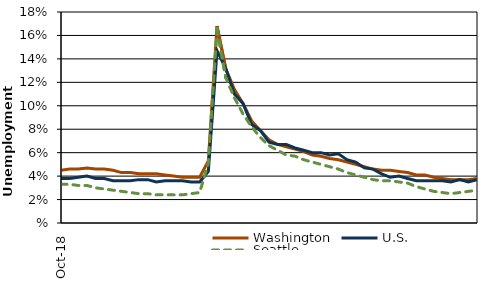
| Category | Washington | U.S. | Seattle |
|---|---|---|---|
| 2018-10-01 | 4.5 | 3.8 | 3.3 |
| 2018-11-01 | 4.6 | 3.8 | 3.3 |
| 2018-12-01 | 4.6 | 3.9 | 3.2 |
| 2019-01-01 | 4.7 | 4 | 3.2 |
| 2019-02-01 | 4.6 | 3.8 | 3 |
| 2019-03-01 | 4.6 | 3.8 | 2.9 |
| 2019-04-01 | 4.5 | 3.6 | 2.8 |
| 2019-05-01 | 4.3 | 3.6 | 2.7 |
| 2019-06-01 | 4.3 | 3.6 | 2.6 |
| 2019-07-01 | 4.2 | 3.7 | 2.5 |
| 2019-08-01 | 4.2 | 3.7 | 2.5 |
| 2019-09-01 | 4.2 | 3.5 | 2.4 |
| 2019-10-01 | 4.1 | 3.6 | 2.4 |
| 2019-11-01 | 4 | 3.6 | 2.4 |
| 2019-12-01 | 3.9 | 3.6 | 2.4 |
| 2020-01-01 | 3.9 | 3.5 | 2.5 |
| 2020-02-01 | 3.9 | 3.5 | 2.6 |
| 2020-03-01 | 5.3 | 4.4 | 5.1 |
| 2020-04-01 | 16.8 | 14.7 | 16.6 |
| 2020-05-01 | 13.2 | 13.2 | 12.4 |
| 2020-06-01 | 11.4 | 11 | 10.7 |
| 2020-07-01 | 10.2 | 10.2 | 9.3 |
| 2020-08-01 | 8.7 | 8.4 | 8.2 |
| 2020-09-01 | 7.9 | 7.9 | 7.3 |
| 2020-10-01 | 7.1 | 6.9 | 6.6 |
| 2020-11-01 | 6.7 | 6.7 | 6.2 |
| 2020-12-01 | 6.5 | 6.7 | 5.8 |
| 2021-01-01 | 6.3 | 6.4 | 5.7 |
| 2021-02-01 | 6.1 | 6.2 | 5.4 |
| 2021-03-01 | 5.8 | 6 | 5.2 |
| 2021-04-01 | 5.7 | 6 | 5 |
| 2021-05-01 | 5.5 | 5.8 | 4.8 |
| 2021-06-01 | 5.4 | 5.9 | 4.6 |
| 2021-07-01 | 5.2 | 5.4 | 4.3 |
| 2021-08-01 | 5 | 5.2 | 4.1 |
| 2021-09-01 | 4.8 | 4.7 | 3.9 |
| 2021-10-01 | 4.6 | 4.6 | 3.7 |
| 2021-11-01 | 4.5 | 4.2 | 3.6 |
| 2021-12-01 | 4.5 | 3.9 | 3.6 |
| 2022-01-01 | 4.4 | 4 | 3.5 |
| 2022-02-01 | 4.3 | 3.8 | 3.4 |
| 2022-03-01 | 4.1 | 3.6 | 3.1 |
| 2022-04-01 | 4.1 | 3.6 | 2.9 |
| 2022-05-01 | 3.9 | 3.6 | 2.7 |
| 2022-06-01 | 3.8 | 3.6 | 2.6 |
| 2022-07-01 | 3.7 | 3.5 | 2.5 |
| 2022-08-01 | 3.7 | 3.7 | 2.6 |
| 2022-09-01 | 3.7 | 3.5 | 2.7 |
| 2022-10-01 | 3.8 | 3.7 | 2.8 |